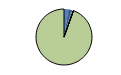
| Category | Series 0 |
|---|---|
| ARRASTRE | 66 |
| CERCO | 47 |
| ATUNEROS CAÑEROS | 12 |
| PALANGRE DE FONDO | 12 |
| PALANGRE DE SUPERFICIE | 3 |
| RASCO | 1 |
| VOLANTA | 1 |
| ARTES FIJAS | 1 |
| ARTES MENORES | 2461 |